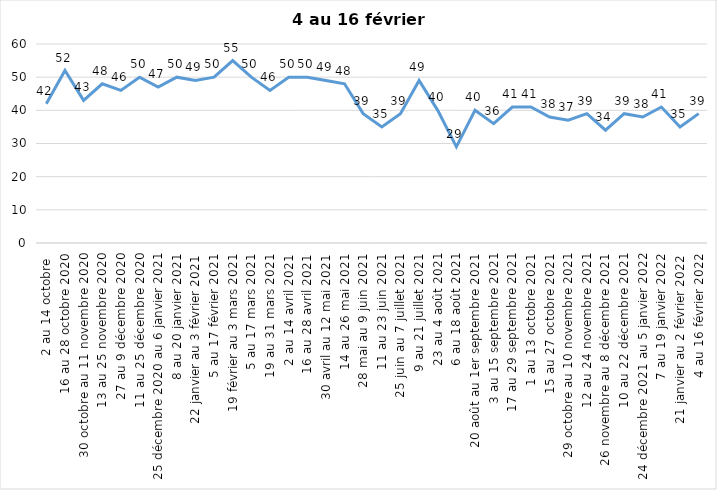
| Category | Toujours aux trois mesures |
|---|---|
| 2 au 14 octobre  | 42 |
| 16 au 28 octobre 2020 | 52 |
| 30 octobre au 11 novembre 2020 | 43 |
| 13 au 25 novembre 2020 | 48 |
| 27 au 9 décembre 2020 | 46 |
| 11 au 25 décembre 2020 | 50 |
| 25 décembre 2020 au 6 janvier 2021 | 47 |
| 8 au 20 janvier 2021 | 50 |
| 22 janvier au 3 février 2021 | 49 |
| 5 au 17 février 2021 | 50 |
| 19 février au 3 mars 2021 | 55 |
| 5 au 17 mars 2021 | 50 |
| 19 au 31 mars 2021 | 46 |
| 2 au 14 avril 2021 | 50 |
| 16 au 28 avril 2021 | 50 |
| 30 avril au 12 mai 2021 | 49 |
| 14 au 26 mai 2021 | 48 |
| 28 mai au 9 juin 2021 | 39 |
| 11 au 23 juin 2021 | 35 |
| 25 juin au 7 juillet 2021 | 39 |
| 9 au 21 juillet 2021 | 49 |
| 23 au 4 août 2021 | 40 |
| 6 au 18 août 2021 | 29 |
| 20 août au 1er septembre 2021 | 40 |
| 3 au 15 septembre 2021 | 36 |
| 17 au 29 septembre 2021 | 41 |
| 1 au 13 octobre 2021 | 41 |
| 15 au 27 octobre 2021 | 38 |
| 29 octobre au 10 novembre 2021 | 37 |
| 12 au 24 novembre 2021 | 39 |
| 26 novembre au 8 décembre 2021 | 34 |
| 10 au 22 décembre 2021 | 39 |
| 24 décembre 2021 au 5 janvier 2022 | 38 |
| 7 au 19 janvier 2022 | 41 |
| 21 janvier au 2 février 2022 | 35 |
| 4 au 16 février 2022 | 39 |